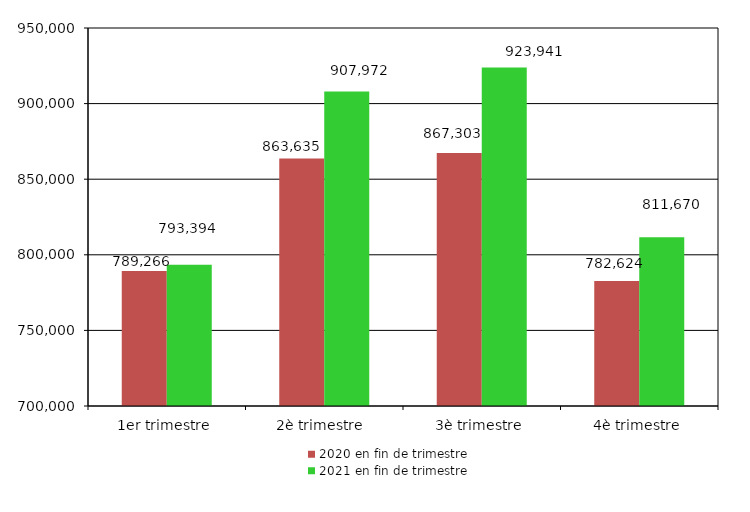
| Category | 2020 en fin de trimestre | 2021 en fin de trimestre |
|---|---|---|
| 1er trimestre | 789266 | 793394 |
| 2è trimestre  | 863635 | 907972 |
| 3è trimestre | 867303 | 923941 |
| 4è trimestre | 782624 | 811670 |